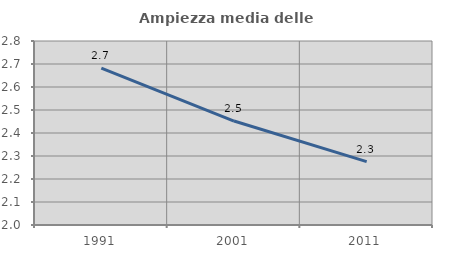
| Category | Ampiezza media delle famiglie |
|---|---|
| 1991.0 | 2.682 |
| 2001.0 | 2.452 |
| 2011.0 | 2.276 |